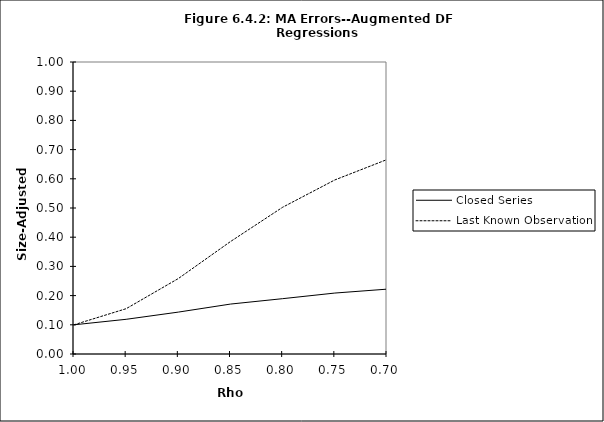
| Category | Closed Series | Last Known Observation |
|---|---|---|
| 1.0 | 0.1 | 0.1 |
| 0.95 | 0.119 | 0.155 |
| 0.9 | 0.144 | 0.258 |
| 0.85 | 0.171 | 0.385 |
| 0.8 | 0.19 | 0.503 |
| 0.75 | 0.209 | 0.596 |
| 0.7 | 0.222 | 0.666 |